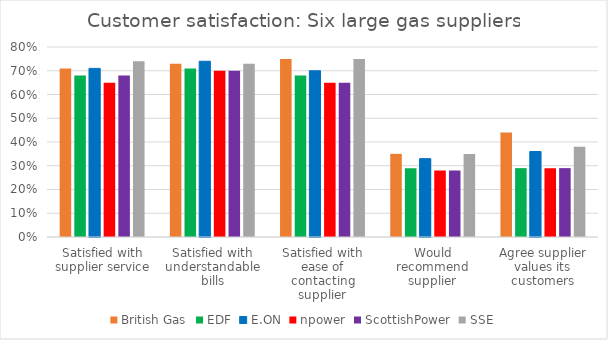
| Category | British Gas | EDF | E.ON | npower | ScottishPower | SSE |
|---|---|---|---|---|---|---|
| Satisfied with supplier service | 0.71 | 0.68 | 0.71 | 0.65 | 0.68 | 0.74 |
| Satisfied with understandable bills | 0.73 | 0.71 | 0.74 | 0.7 | 0.7 | 0.73 |
| Satisfied with ease of contacting supplier | 0.75 | 0.68 | 0.7 | 0.65 | 0.65 | 0.75 |
| Would recommend supplier | 0.35 | 0.29 | 0.33 | 0.28 | 0.28 | 0.35 |
| Agree supplier values its customers | 0.44 | 0.29 | 0.36 | 0.29 | 0.29 | 0.38 |